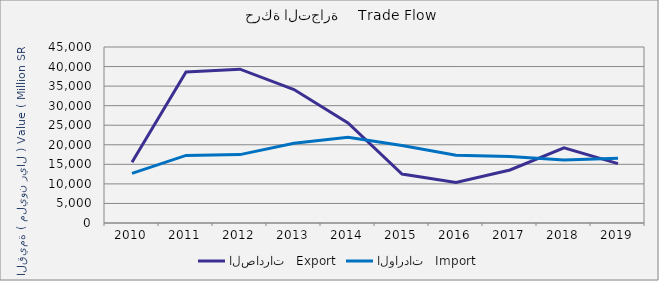
| Category | الصادرات   Export | الواردات   Import |
|---|---|---|
| 2010.0 | 15529207896 | 12681714272 |
| 2011.0 | 38611127761 | 17289754717 |
| 2012.0 | 39325603340 | 17484411717 |
| 2013.0 | 34115041456 | 20374073609 |
| 2014.0 | 25560310887 | 21928933638 |
| 2015.0 | 12519844546 | 19834714253 |
| 2016.0 | 10375106638 | 17338944185 |
| 2017.0 | 13558990559 | 16979611510 |
| 2018.0 | 19215477579 | 16088020563 |
| 2019.0 | 15169200411 | 16544171744 |